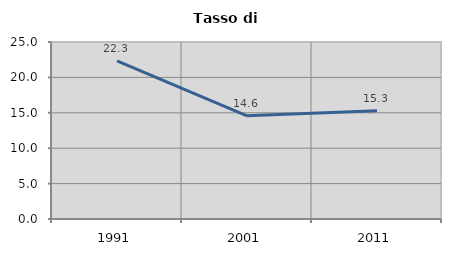
| Category | Tasso di disoccupazione   |
|---|---|
| 1991.0 | 22.323 |
| 2001.0 | 14.571 |
| 2011.0 | 15.293 |